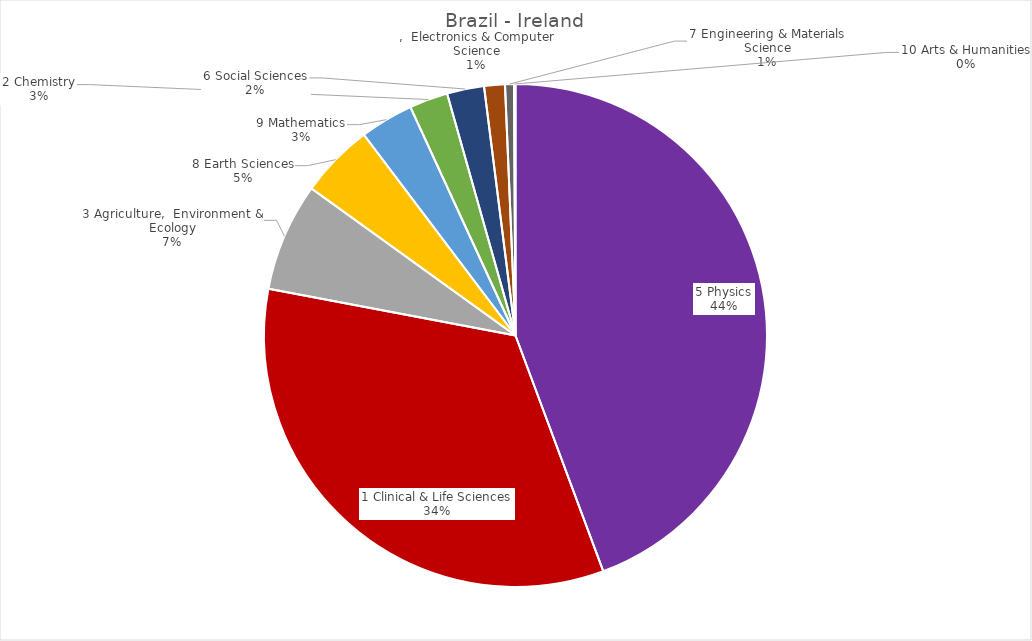
| Category | Web of Science Documents |
|---|---|
| 5 Physics | 465 |
| 1 Clinical & Life Sciences | 353 |
| 3 Agriculture,  Environment & Ecology | 73 |
| 8 Earth Sciences | 50 |
| 9 Mathematics | 36 |
| 2 Chemistry | 26 |
| 6 Social Sciences | 25 |
| ,  Electronics & Computer Science | 14 |
| 7 Engineering & Materials Science | 6 |
| 10 Arts & Humanities | 1 |